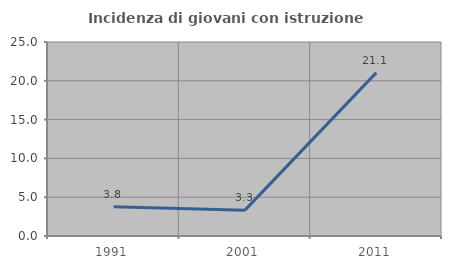
| Category | Incidenza di giovani con istruzione universitaria |
|---|---|
| 1991.0 | 3.774 |
| 2001.0 | 3.333 |
| 2011.0 | 21.053 |